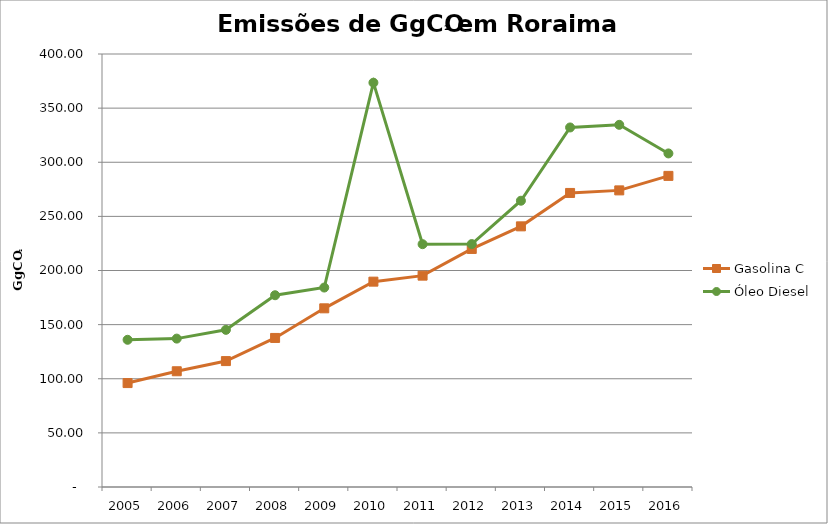
| Category | Gasolina C | Óleo Diesel |
|---|---|---|
| 2005.0 | 96.004 | 135.99 |
| 2006.0 | 106.928 | 137.083 |
| 2007.0 | 116.322 | 145.179 |
| 2008.0 | 137.692 | 177.146 |
| 2009.0 | 165.058 | 184.254 |
| 2010.0 | 189.701 | 373.506 |
| 2011.0 | 195.241 | 224.324 |
| 2012.0 | 219.917 | 224.414 |
| 2013.0 | 240.777 | 264.458 |
| 2014.0 | 271.64 | 332.131 |
| 2015.0 | 274.018 | 334.576 |
| 2016.0 | 287.406 | 308.142 |